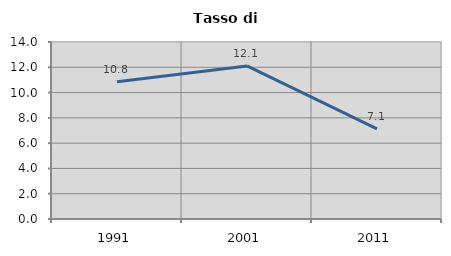
| Category | Tasso di disoccupazione   |
|---|---|
| 1991.0 | 10.847 |
| 2001.0 | 12.108 |
| 2011.0 | 7.125 |